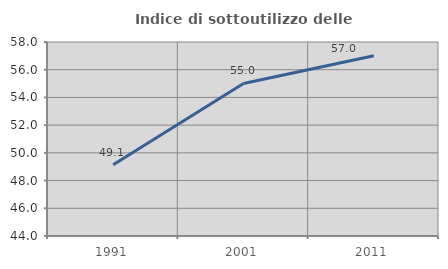
| Category | Indice di sottoutilizzo delle abitazioni  |
|---|---|
| 1991.0 | 49.14 |
| 2001.0 | 55.011 |
| 2011.0 | 57.011 |